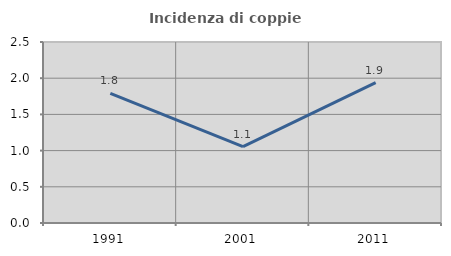
| Category | Incidenza di coppie miste |
|---|---|
| 1991.0 | 1.791 |
| 2001.0 | 1.055 |
| 2011.0 | 1.939 |